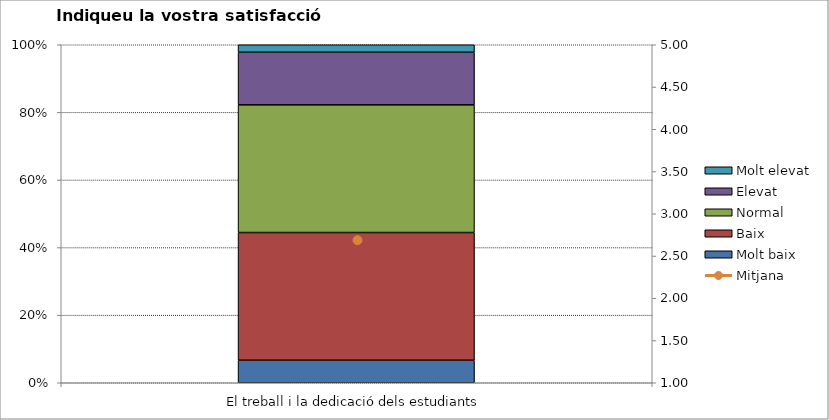
| Category | Molt baix | Baix | Normal  | Elevat | Molt elevat |
|---|---|---|---|---|---|
| El treball i la dedicació dels estudiants | 3 | 17 | 17 | 7 | 1 |